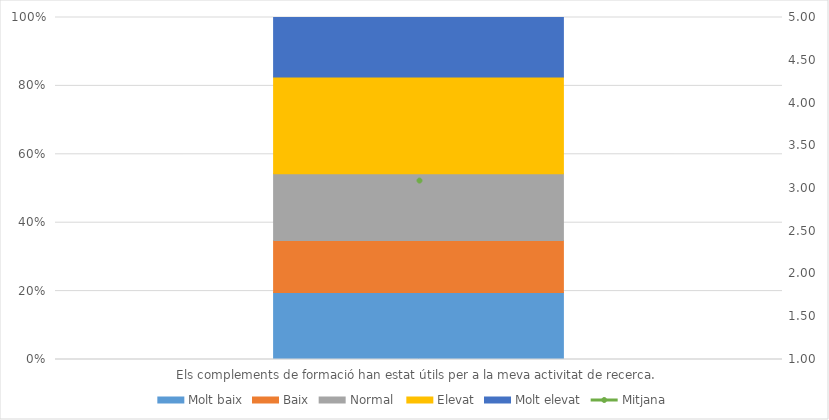
| Category | Molt baix | Baix | Normal  | Elevat | Molt elevat |
|---|---|---|---|---|---|
| Els complements de formació han estat útils per a la meva activitat de recerca. | 9 | 7 | 9 | 13 | 8 |